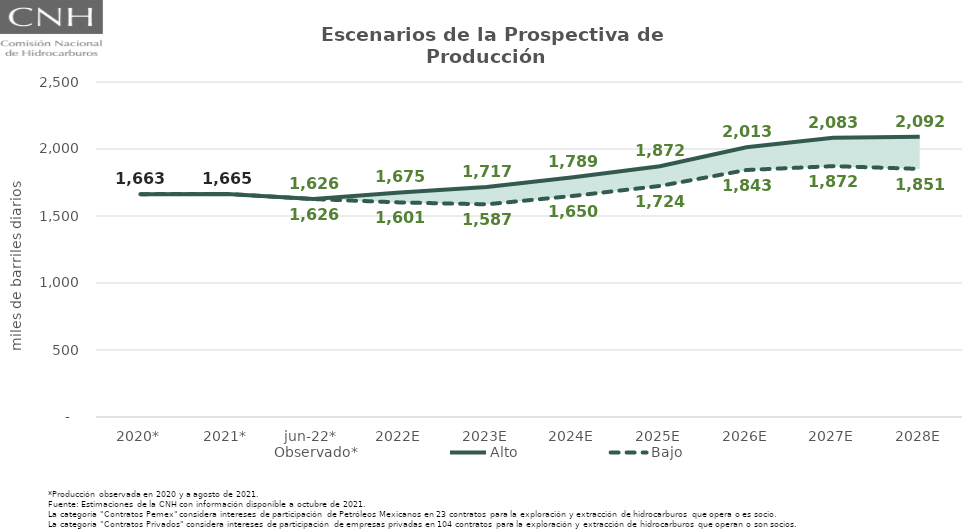
| Category | Observado* | Alto | Bajo |
|---|---|---|---|
| 2020* | 1663.042 | 1663.042 | 1663.042 |
| 2021* | 1664.708 | 1664.708 | 1664.708 |
| jun-22* | 1626.428 | 1626.428 | 1626.428 |
| 2022E | 1644.93 | 1675.409 | 1601.144 |
| 2023E | 1679.08 | 1716.756 | 1587.114 |
| 2024E | 1746.672 | 1788.584 | 1650.014 |
| 2025E | 1807.591 | 1871.92 | 1724.282 |
| 2026E | 1915.996 | 2013.387 | 1843.205 |
| 2027E | 1945.473 | 2083.109 | 1872.17 |
| 2028E | 1923.08 | 2091.513 | 1851.363 |